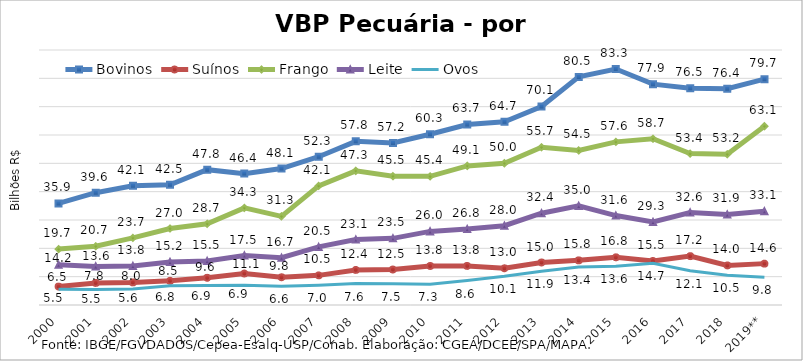
| Category | Bovinos | Suínos | Frango | Leite | Ovos |
|---|---|---|---|---|---|
| 2000 | 35.857 | 6.493 | 19.731 | 14.163 | 5.538 |
| 2001 | 39.637 | 7.789 | 20.738 | 13.629 | 5.457 |
| 2002 | 42.062 | 7.983 | 23.672 | 13.8 | 5.622 |
| 2003 | 42.452 | 8.532 | 26.988 | 15.197 | 6.801 |
| 2004 | 47.763 | 9.593 | 28.658 | 15.532 | 6.893 |
| 2005 | 46.371 | 11.122 | 34.262 | 17.47 | 6.939 |
| 2006 | 48.145 | 9.783 | 31.3 | 16.686 | 6.592 |
| 2007 | 52.322 | 10.461 | 42.055 | 20.513 | 7.006 |
| 2008 | 57.77 | 12.387 | 47.34 | 23.076 | 7.566 |
| 2009 | 57.167 | 12.522 | 45.453 | 23.527 | 7.544 |
| 2010 | 60.272 | 13.775 | 45.398 | 25.982 | 7.337 |
| 2011 | 63.716 | 13.797 | 49.101 | 26.784 | 8.646 |
| 2012 | 64.666 | 12.954 | 50.017 | 27.989 | 10.135 |
| 2013 | 70.075 | 14.999 | 55.669 | 32.388 | 11.92 |
| 2014 | 80.504 | 15.754 | 54.544 | 34.975 | 13.393 |
| 2015 | 83.274 | 16.836 | 57.581 | 31.571 | 13.636 |
| 2016 | 77.949 | 15.537 | 58.671 | 29.294 | 14.701 |
| 2017 | 76.493 | 17.248 | 53.439 | 32.64 | 12.117 |
| 2018 | 76.364 | 13.971 | 53.21 | 31.945 | 10.477 |
| 2019** | 79.696 | 14.604 | 63.109 | 33.086 | 9.766 |